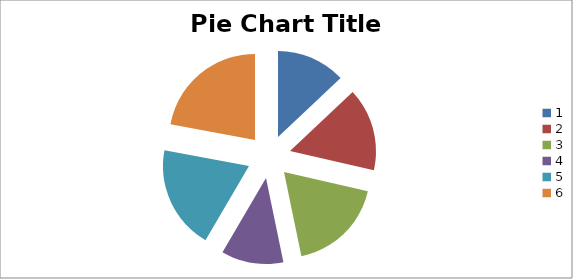
| Category | Series 0 |
|---|---|
| 0 | 10 |
| 1 | 12 |
| 2 | 14 |
| 3 | 9 |
| 4 | 15 |
| 5 | 17 |